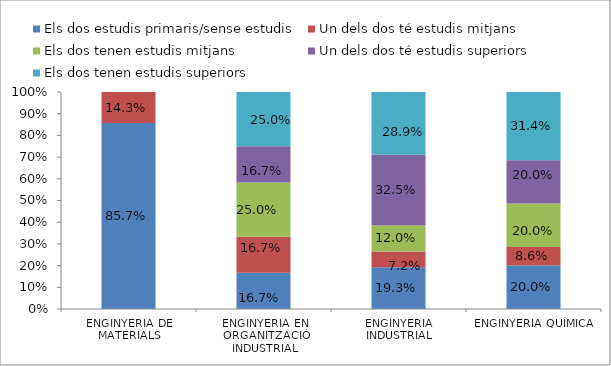
| Category | Els dos estudis primaris/sense estudis | Un dels dos té estudis mitjans | Els dos tenen estudis mitjans | Un dels dos té estudis superiors | Els dos tenen estudis superiors |
|---|---|---|---|---|---|
| ENGINYERIA DE MATERIALS | 0.857 | 0.143 | 0 | 0 | 0 |
| ENGINYERIA EN ORGANITZACIÓ INDUSTRIAL | 0.167 | 0.167 | 0.25 | 0.167 | 0.25 |
| ENGINYERIA INDUSTRIAL | 0.193 | 0.072 | 0.12 | 0.325 | 0.289 |
| ENGINYERIA QUÍMICA | 0.2 | 0.086 | 0.2 | 0.2 | 0.314 |